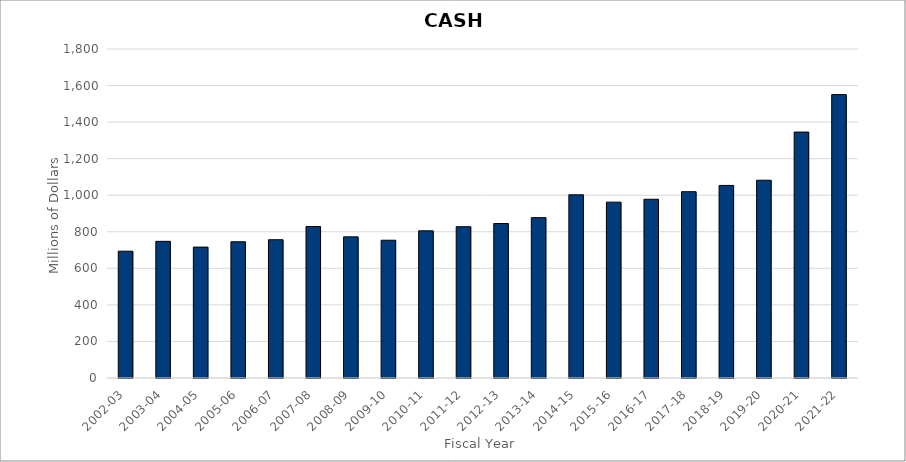
| Category | CASH |
|---|---|
| 2002-03 | 693.782 |
| 2003-04 | 747.625 |
| 2004-05 | 716.148 |
| 2005-06 | 745.245 |
| 2006-07 | 756.553 |
| 2007-08 | 828.628 |
| 2008-09 | 772.165 |
| 2009-10 | 753.778 |
| 2010-11 | 805.214 |
| 2011-12 | 827.682 |
| 2012-13 | 845.258 |
| 2013-14 | 877.423 |
| 2014-15 | 1002.259 |
| 2015-16 | 962.234 |
| 2016-17 | 977.927 |
| 2017-18 | 1019.323 |
| 2018-19 | 1053.588 |
| 2019-20 | 1082.038 |
| 2020-21 | 1345.5 |
| 2021-22 | 1550.429 |